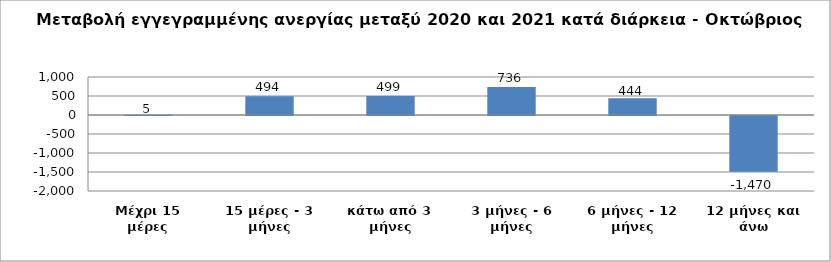
| Category | Series 0 |
|---|---|
| Μέχρι 15 μέρες | 5 |
| 15 μέρες - 3 μήνες | 494 |
| κάτω από 3 μήνες | 499 |
| 3 μήνες - 6 μήνες | 736 |
| 6 μήνες - 12 μήνες | 444 |
| 12 μήνες και άνω | -1470 |